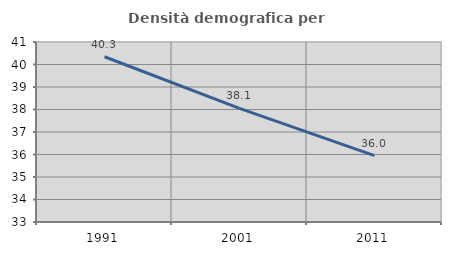
| Category | Densità demografica |
|---|---|
| 1991.0 | 40.344 |
| 2001.0 | 38.05 |
| 2011.0 | 35.95 |